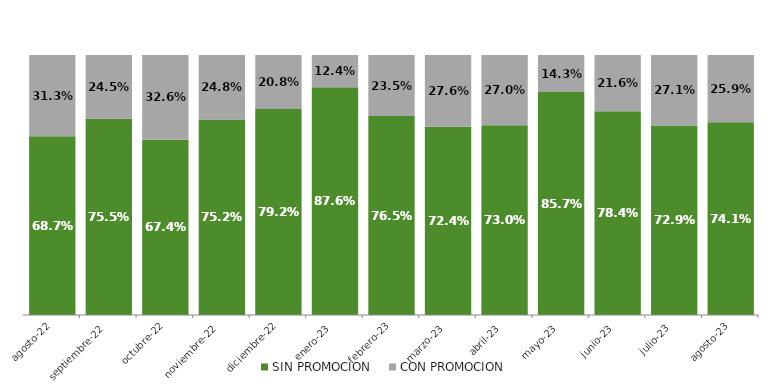
| Category | SIN PROMOCION   | CON PROMOCION   |
|---|---|---|
| 2022-08-01 | 0.687 | 0.313 |
| 2022-09-01 | 0.755 | 0.245 |
| 2022-10-01 | 0.674 | 0.326 |
| 2022-11-01 | 0.752 | 0.248 |
| 2022-12-01 | 0.792 | 0.208 |
| 2023-01-01 | 0.876 | 0.124 |
| 2023-02-01 | 0.765 | 0.235 |
| 2023-03-01 | 0.724 | 0.276 |
| 2023-04-01 | 0.73 | 0.27 |
| 2023-05-01 | 0.857 | 0.143 |
| 2023-06-01 | 0.784 | 0.216 |
| 2023-07-01 | 0.729 | 0.271 |
| 2023-08-01 | 0.741 | 0.259 |